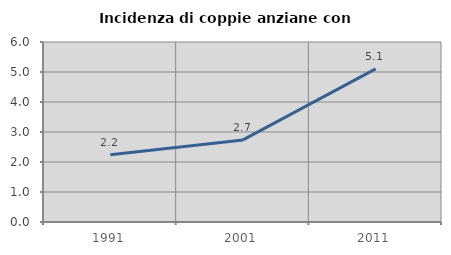
| Category | Incidenza di coppie anziane con figli |
|---|---|
| 1991.0 | 2.24 |
| 2001.0 | 2.737 |
| 2011.0 | 5.106 |